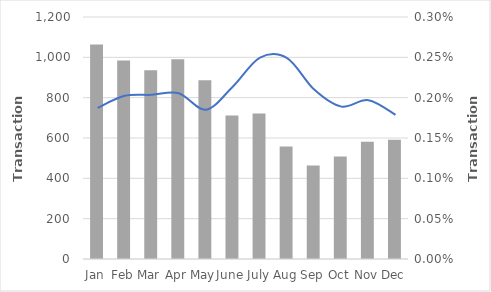
| Category | Transactions |
|---|---|
| Jan | 1064 |
| Feb | 984 |
| Mar | 936 |
| Apr | 990 |
| May | 886 |
| June | 711 |
| July | 722 |
| Aug | 558 |
| Sep | 464 |
| Oct | 508 |
| Nov | 582 |
| Dec | 591 |